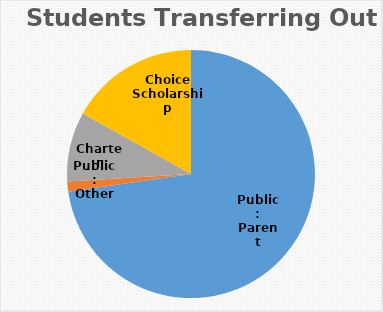
| Category | Series 0 |
|---|---|
| Public: Parent Choice | 56 |
| Public: Other | 1 |
| Charter | 7 |
| Choice Scholarship | 13 |